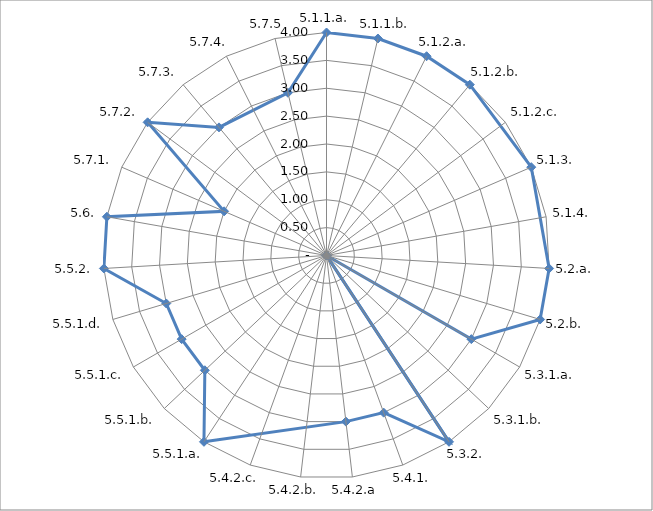
| Category | Series 0 |
|---|---|
| 5.1.1.a. | 4 |
| 5.1.1.b. | 4 |
| 5.1.2.a. | 4 |
| 5.1.2.b. | 4 |
| 5.1.2.c. | 0 |
| 5.1.3. | 4 |
| 5.1.4. | 0 |
| 5.2.a. | 4 |
| 5.2.b. | 4 |
| 5.3.1.a. | 3 |
| 5.3.1.b. | 0 |
| 5.3.2. | 4 |
| 5.4.1. | 3 |
| 5.4.2.a | 3 |
| 5.4.2.b. | 0 |
| 5.4.2.c. | 0 |
| 5.5.1.a. | 4 |
| 5.5.1.b. | 3 |
| 5.5.1.c. | 3 |
| 5.5.1.d. | 3 |
| 5.5.2. | 4 |
| 5.6. | 4 |
| 5.7.1. | 2 |
| 5.7.2. | 4 |
| 5.7.3. | 3 |
| 5.7.4. | 0 |
| 5.7.5 | 3 |